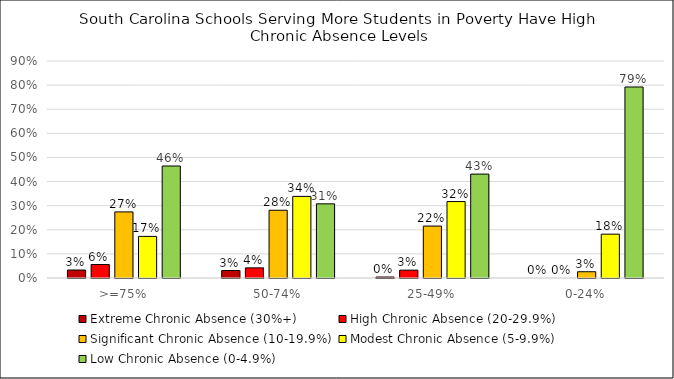
| Category | Extreme Chronic Absence (30%+) | High Chronic Absence (20-29.9%) | Significant Chronic Absence (10-19.9%) | Modest Chronic Absence (5-9.9%) | Low Chronic Absence (0-4.9%) |
|---|---|---|---|---|---|
| >=75% | 0.033 | 0.056 | 0.274 | 0.173 | 0.464 |
| 50-74% | 0.031 | 0.042 | 0.281 | 0.338 | 0.308 |
| 25-49% | 0.004 | 0.033 | 0.215 | 0.317 | 0.431 |
| 0-24% | 0 | 0 | 0.026 | 0.182 | 0.792 |